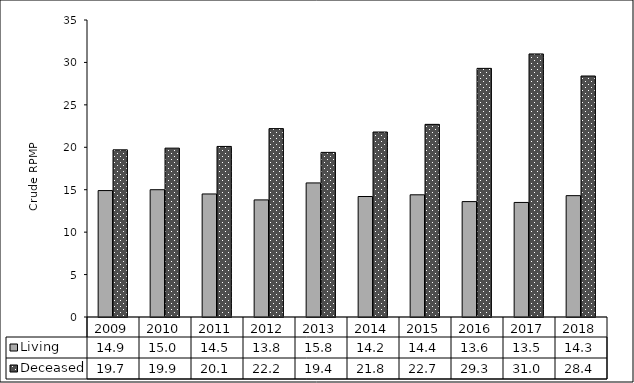
| Category | Living | Deceased |
|---|---|---|
| 2009.0 | 14.9 | 19.7 |
| 2010.0 | 15 | 19.9 |
| 2011.0 | 14.5 | 20.1 |
| 2012.0 | 13.8 | 22.2 |
| 2013.0 | 15.8 | 19.4 |
| 2014.0 | 14.2 | 21.8 |
| 2015.0 | 14.4 | 22.7 |
| 2016.0 | 13.6 | 29.3 |
| 2017.0 | 13.5 | 31 |
| 2018.0 | 14.3 | 28.4 |